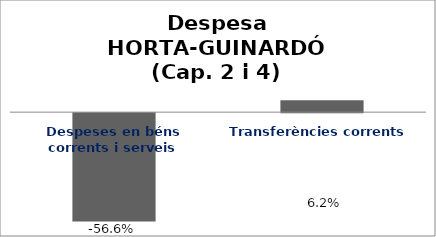
| Category | Series 0 |
|---|---|
| Despeses en béns corrents i serveis | -0.566 |
| Transferències corrents | 0.062 |